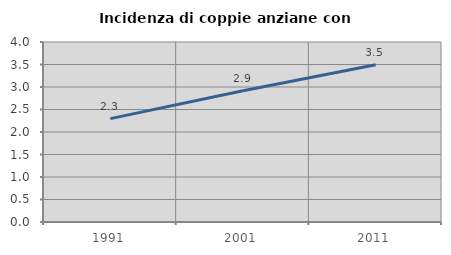
| Category | Incidenza di coppie anziane con figli |
|---|---|
| 1991.0 | 2.297 |
| 2001.0 | 2.916 |
| 2011.0 | 3.495 |